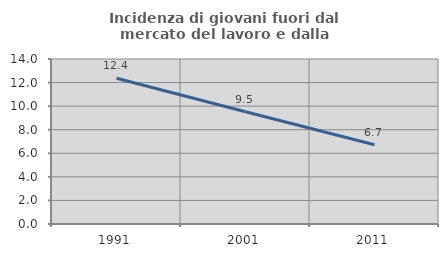
| Category | Incidenza di giovani fuori dal mercato del lavoro e dalla formazione  |
|---|---|
| 1991.0 | 12.367 |
| 2001.0 | 9.524 |
| 2011.0 | 6.731 |